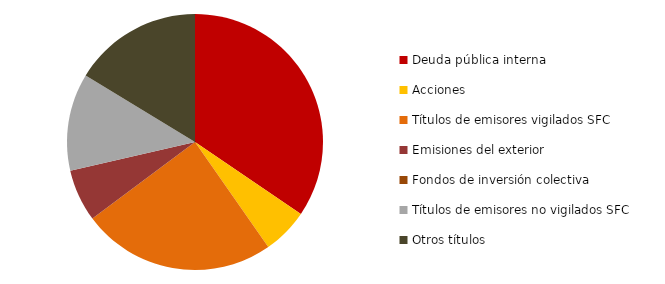
| Category | Series 0 |
|---|---|
| Deuda pública interna | 0.345 |
| Acciones | 0.058 |
| Títulos de emisores vigilados SFC | 0.245 |
| Emisiones del exterior | 0.066 |
| Fondos de inversión colectiva | 0 |
| Títulos de emisores no vigilados SFC | 0.123 |
| Otros títulos | 0.163 |